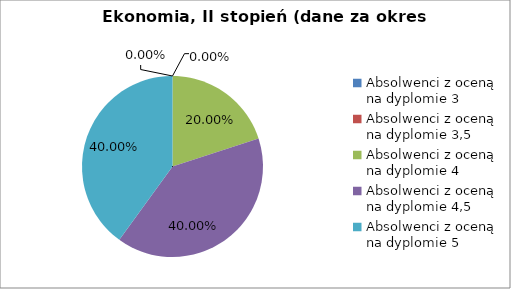
| Category | Series 0 |
|---|---|
| Absolwenci z oceną na dyplomie 3 | 0 |
| Absolwenci z oceną na dyplomie 3,5 | 0 |
| Absolwenci z oceną na dyplomie 4 | 20 |
| Absolwenci z oceną na dyplomie 4,5 | 40 |
| Absolwenci z oceną na dyplomie 5 | 40 |